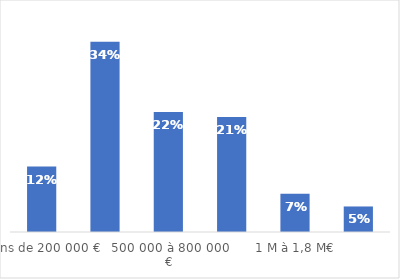
| Category | Series 0 |
|---|---|
| Moins de 200 000 € | 0.118 |
| 200 000 à 500 000 € | 0.343 |
| 500 000 à 800 000 € | 0.216 |
| 800 000 à 1M€ | 0.207 |
| 1 M à 1,8 M€ | 0.069 |
| Plus de 1,8 M€ | 0.046 |